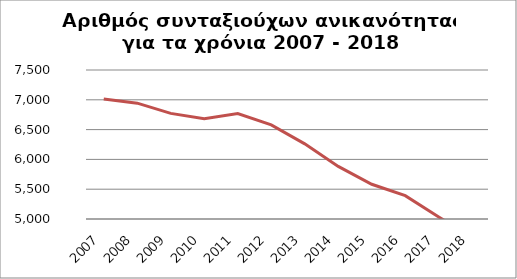
| Category | Series 1 |
|---|---|
| 2007.0 | 7013 |
| 2008.0 | 6944 |
| 2009.0 | 6772 |
| 2010.0 | 6683 |
| 2011.0 | 6768 |
| 2012.0 | 6578 |
| 2013.0 | 6261 |
| 2014.0 | 5883 |
| 2015.0 | 5583 |
| 2016.0 | 5392 |
| 2017.0 | 5035 |
| 2018.0 | 4683 |